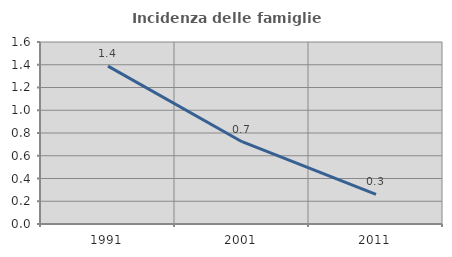
| Category | Incidenza delle famiglie numerose |
|---|---|
| 1991.0 | 1.388 |
| 2001.0 | 0.723 |
| 2011.0 | 0.261 |